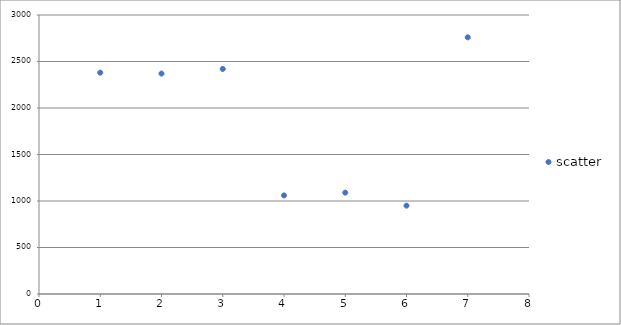
| Category | scatter  |
|---|---|
| 0 | 2380 |
| 1 | 2370 |
| 2 | 2420 |
| 3 | 1060 |
| 4 | 1090 |
| 5 | 950 |
| 6 | 2760 |